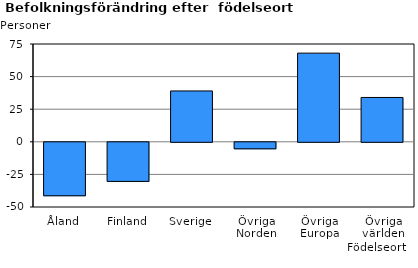
| Category | Series 0 |
|---|---|
| Åland | -41 |
| Finland | -30 |
| Sverige | 39 |
| Övriga Norden | -5 |
| Övriga Europa | 68 |
| Övriga världen | 34 |